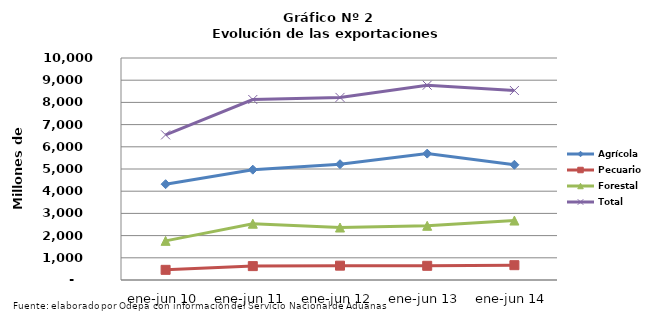
| Category | Agrícola | Pecuario | Forestal | Total |
|---|---|---|---|---|
| ene-jun 10 | 4315945 | 457632 | 1763414 | 6536991 |
| ene-jun 11 | 4969737 | 625316 | 2535519 | 8130572 |
| ene-jun 12 | 5214824 | 645830 | 2364076 | 8224730 |
| ene-jun 13 | 5693819 | 639335 | 2441698 | 8774852 |
| ene-jun 14 | 5190427 | 667436 | 2677834 | 8535697 |